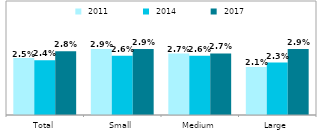
| Category |  2011 |  2014 |  2017 |
|---|---|---|---|
| Total | 0.025 | 0.024 | 0.028 |
| Small | 0.029 | 0.026 | 0.029 |
| Medium | 0.027 | 0.026 | 0.027 |
| Large | 0.021 | 0.023 | 0.029 |